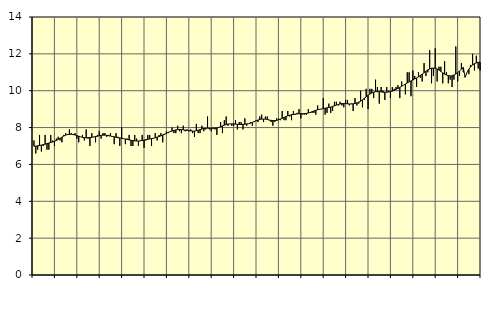
| Category | Offentlig förvaltning m.m., SNI 84, 99 | Series 1 |
|---|---|---|
| nan | 7.3 | 6.99 |
| 1.0 | 6.6 | 6.99 |
| 1.0 | 6.8 | 7.01 |
| 1.0 | 7.6 | 7.03 |
| 1.0 | 6.7 | 7.05 |
| 1.0 | 7 | 7.08 |
| 1.0 | 7.6 | 7.1 |
| 1.0 | 6.8 | 7.13 |
| 1.0 | 6.8 | 7.16 |
| 1.0 | 7.6 | 7.19 |
| 1.0 | 7.3 | 7.22 |
| 1.0 | 7 | 7.25 |
| nan | 7.4 | 7.3 |
| 2.0 | 7.5 | 7.36 |
| 2.0 | 7.3 | 7.42 |
| 2.0 | 7.2 | 7.48 |
| 2.0 | 7.6 | 7.54 |
| 2.0 | 7.7 | 7.59 |
| 2.0 | 7.6 | 7.62 |
| 2.0 | 7.9 | 7.63 |
| 2.0 | 7.7 | 7.64 |
| 2.0 | 7.6 | 7.62 |
| 2.0 | 7.7 | 7.6 |
| 2.0 | 7.4 | 7.57 |
| nan | 7.2 | 7.53 |
| 3.0 | 7.5 | 7.5 |
| 3.0 | 7.6 | 7.47 |
| 3.0 | 7.3 | 7.45 |
| 3.0 | 7.9 | 7.44 |
| 3.0 | 7.4 | 7.45 |
| 3.0 | 7 | 7.46 |
| 3.0 | 7.7 | 7.47 |
| 3.0 | 7.5 | 7.49 |
| 3.0 | 7.2 | 7.51 |
| 3.0 | 7.6 | 7.53 |
| 3.0 | 7.8 | 7.56 |
| nan | 7.4 | 7.58 |
| 4.0 | 7.7 | 7.59 |
| 4.0 | 7.7 | 7.59 |
| 4.0 | 7.5 | 7.58 |
| 4.0 | 7.6 | 7.56 |
| 4.0 | 7.7 | 7.54 |
| 4.0 | 7.5 | 7.52 |
| 4.0 | 7.1 | 7.5 |
| 4.0 | 7.7 | 7.47 |
| 4.0 | 7.5 | 7.45 |
| 4.0 | 7 | 7.44 |
| 4.0 | 8 | 7.42 |
| nan | 7.4 | 7.4 |
| 5.0 | 7.1 | 7.38 |
| 5.0 | 7.4 | 7.36 |
| 5.0 | 7.6 | 7.33 |
| 5.0 | 7 | 7.31 |
| 5.0 | 7 | 7.29 |
| 5.0 | 7.6 | 7.28 |
| 5.0 | 7.4 | 7.27 |
| 5.0 | 7 | 7.27 |
| 5.0 | 7.3 | 7.28 |
| 5.0 | 7.6 | 7.3 |
| 5.0 | 6.9 | 7.32 |
| nan | 7.3 | 7.34 |
| 6.0 | 7.6 | 7.36 |
| 6.0 | 7.6 | 7.38 |
| 6.0 | 7 | 7.4 |
| 6.0 | 7.4 | 7.42 |
| 6.0 | 7.7 | 7.45 |
| 6.0 | 7.3 | 7.48 |
| 6.0 | 7.6 | 7.51 |
| 6.0 | 7.7 | 7.55 |
| 6.0 | 7.2 | 7.6 |
| 6.0 | 7.6 | 7.64 |
| 6.0 | 7.8 | 7.69 |
| nan | 7.7 | 7.74 |
| 7.0 | 7.8 | 7.78 |
| 7.0 | 8 | 7.81 |
| 7.0 | 7.7 | 7.85 |
| 7.0 | 7.7 | 7.87 |
| 7.0 | 8.1 | 7.89 |
| 7.0 | 7.8 | 7.89 |
| 7.0 | 7.7 | 7.89 |
| 7.0 | 8.1 | 7.88 |
| 7.0 | 7.8 | 7.86 |
| 7.0 | 7.9 | 7.85 |
| 7.0 | 7.8 | 7.83 |
| nan | 7.9 | 7.82 |
| 8.0 | 7.7 | 7.81 |
| 8.0 | 7.5 | 7.81 |
| 8.0 | 8.2 | 7.83 |
| 8.0 | 7.7 | 7.86 |
| 8.0 | 7.7 | 7.89 |
| 8.0 | 8.1 | 7.92 |
| 8.0 | 7.8 | 7.95 |
| 8.0 | 7.9 | 7.96 |
| 8.0 | 8.6 | 7.97 |
| 8.0 | 7.9 | 7.96 |
| 8.0 | 7.8 | 7.96 |
| nan | 8 | 7.96 |
| 9.0 | 7.9 | 7.97 |
| 9.0 | 7.6 | 7.98 |
| 9.0 | 8 | 8.01 |
| 9.0 | 8.3 | 8.05 |
| 9.0 | 7.7 | 8.09 |
| 9.0 | 8.4 | 8.13 |
| 9.0 | 8.6 | 8.16 |
| 9.0 | 8.1 | 8.19 |
| 9.0 | 8.2 | 8.2 |
| 9.0 | 8.1 | 8.2 |
| 9.0 | 8.1 | 8.2 |
| nan | 8.4 | 8.19 |
| 10.0 | 7.9 | 8.18 |
| 10.0 | 8.3 | 8.17 |
| 10.0 | 8.3 | 8.17 |
| 10.0 | 7.9 | 8.17 |
| 10.0 | 8.5 | 8.18 |
| 10.0 | 8.1 | 8.2 |
| 10.0 | 8.2 | 8.21 |
| 10.0 | 8.3 | 8.24 |
| 10.0 | 8.1 | 8.28 |
| 10.0 | 8.3 | 8.32 |
| 10.0 | 8.4 | 8.37 |
| nan | 8.3 | 8.41 |
| 11.0 | 8.6 | 8.44 |
| 11.0 | 8.7 | 8.46 |
| 11.0 | 8.3 | 8.46 |
| 11.0 | 8.6 | 8.46 |
| 11.0 | 8.6 | 8.44 |
| 11.0 | 8.4 | 8.41 |
| 11.0 | 8.3 | 8.39 |
| 11.0 | 8.1 | 8.38 |
| 11.0 | 8.3 | 8.38 |
| 11.0 | 8.5 | 8.39 |
| 11.0 | 8.5 | 8.42 |
| nan | 8.4 | 8.46 |
| 12.0 | 8.9 | 8.51 |
| 12.0 | 8.4 | 8.55 |
| 12.0 | 8.4 | 8.6 |
| 12.0 | 8.9 | 8.64 |
| 12.0 | 8.6 | 8.67 |
| 12.0 | 8.4 | 8.7 |
| 12.0 | 8.9 | 8.71 |
| 12.0 | 8.7 | 8.73 |
| 12.0 | 8.8 | 8.74 |
| 12.0 | 9 | 8.75 |
| 12.0 | 8.5 | 8.75 |
| nan | 8.7 | 8.75 |
| 13.0 | 8.7 | 8.76 |
| 13.0 | 8.7 | 8.77 |
| 13.0 | 9 | 8.79 |
| 13.0 | 8.8 | 8.82 |
| 13.0 | 8.8 | 8.86 |
| 13.0 | 8.8 | 8.9 |
| 13.0 | 8.7 | 8.94 |
| 13.0 | 9.2 | 8.97 |
| 13.0 | 9 | 8.99 |
| 13.0 | 9 | 9.01 |
| 13.0 | 9.6 | 9.03 |
| nan | 8.7 | 9.05 |
| 14.0 | 8.8 | 9.07 |
| 14.0 | 9.3 | 9.09 |
| 14.0 | 8.8 | 9.11 |
| 14.0 | 8.9 | 9.15 |
| 14.0 | 9.4 | 9.18 |
| 14.0 | 9.4 | 9.22 |
| 14.0 | 9.2 | 9.25 |
| 14.0 | 9.4 | 9.28 |
| 14.0 | 9.2 | 9.3 |
| 14.0 | 9.1 | 9.3 |
| 14.0 | 9.5 | 9.3 |
| nan | 9.5 | 9.29 |
| 15.0 | 9.2 | 9.28 |
| 15.0 | 9.3 | 9.28 |
| 15.0 | 8.9 | 9.29 |
| 15.0 | 9.6 | 9.31 |
| 15.0 | 9.2 | 9.34 |
| 15.0 | 9.3 | 9.38 |
| 15.0 | 10 | 9.43 |
| 15.0 | 9.1 | 9.5 |
| 15.0 | 9.5 | 9.59 |
| 15.0 | 10.1 | 9.67 |
| 15.0 | 9 | 9.75 |
| nan | 10.1 | 9.82 |
| 16.0 | 10.1 | 9.88 |
| 16.0 | 9.6 | 9.92 |
| 16.0 | 10.6 | 9.95 |
| 16.0 | 10.2 | 9.95 |
| 16.0 | 9.3 | 9.95 |
| 16.0 | 10.2 | 9.94 |
| 16.0 | 10 | 9.92 |
| 16.0 | 9.5 | 9.91 |
| 16.0 | 10.2 | 9.92 |
| 16.0 | 10 | 9.93 |
| 16.0 | 9.6 | 9.95 |
| nan | 10.2 | 9.98 |
| 17.0 | 10.1 | 10.02 |
| 17.0 | 10.2 | 10.07 |
| 17.0 | 10.3 | 10.12 |
| 17.0 | 9.6 | 10.18 |
| 17.0 | 10.5 | 10.24 |
| 17.0 | 10.3 | 10.3 |
| 17.0 | 9.8 | 10.36 |
| 17.0 | 11 | 10.42 |
| 17.0 | 11 | 10.48 |
| 17.0 | 9.7 | 10.53 |
| 17.0 | 11.1 | 10.58 |
| nan | 10.8 | 10.64 |
| 18.0 | 10.2 | 10.69 |
| 18.0 | 11 | 10.76 |
| 18.0 | 10.7 | 10.83 |
| 18.0 | 10.5 | 10.9 |
| 18.0 | 11.5 | 10.98 |
| 18.0 | 10.8 | 11.06 |
| 18.0 | 11 | 11.13 |
| 18.0 | 12.2 | 11.18 |
| 18.0 | 10.4 | 11.22 |
| 18.0 | 10.8 | 11.23 |
| 18.0 | 12.3 | 11.22 |
| nan | 10.5 | 11.18 |
| 19.0 | 11.3 | 11.12 |
| 19.0 | 11.3 | 11.05 |
| 19.0 | 10.4 | 10.97 |
| 19.0 | 11.6 | 10.9 |
| 19.0 | 11 | 10.85 |
| 19.0 | 10.4 | 10.82 |
| 19.0 | 10.6 | 10.8 |
| 19.0 | 10.2 | 10.81 |
| 19.0 | 10.6 | 10.85 |
| 19.0 | 12.4 | 10.91 |
| 19.0 | 10.5 | 10.98 |
| nan | 10.8 | 11.07 |
| 20.0 | 11.5 | 11.17 |
| 20.0 | 11 | 11.26 |
| 20.0 | 10.8 | 10.73 |
| 20.0 | 11 | 10.99 |
| 20.0 | 10.9 | 11.17 |
| 20.0 | 11.4 | 11.3 |
| 20.0 | 12 | 11.4 |
| 20.0 | 11.1 | 11.47 |
| 20.0 | 11.9 | 11.51 |
| 20.0 | 11.2 | 11.54 |
| 20.0 | 11.1 | 11.55 |